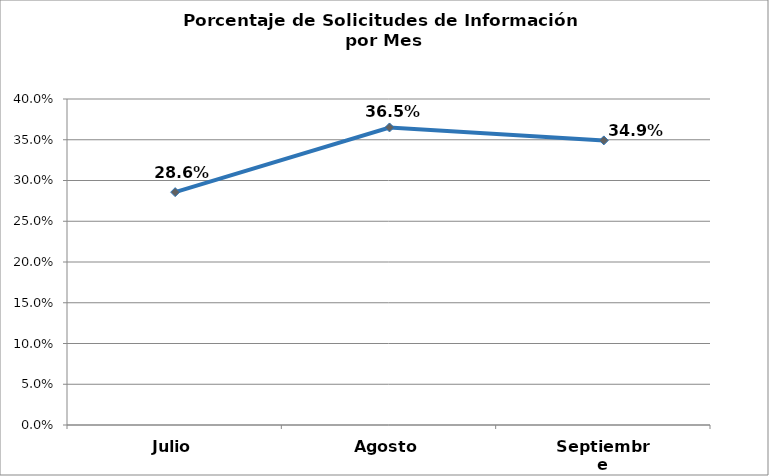
| Category | Series 0 |
|---|---|
| Julio | 0.286 |
| Agosto | 0.365 |
| Septiembre | 0.349 |